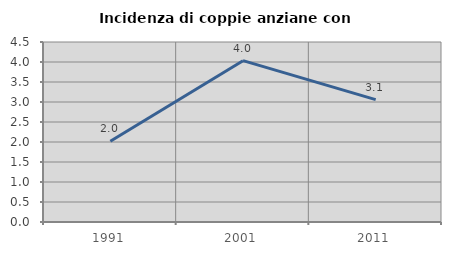
| Category | Incidenza di coppie anziane con figli |
|---|---|
| 1991.0 | 2.02 |
| 2001.0 | 4.033 |
| 2011.0 | 3.059 |